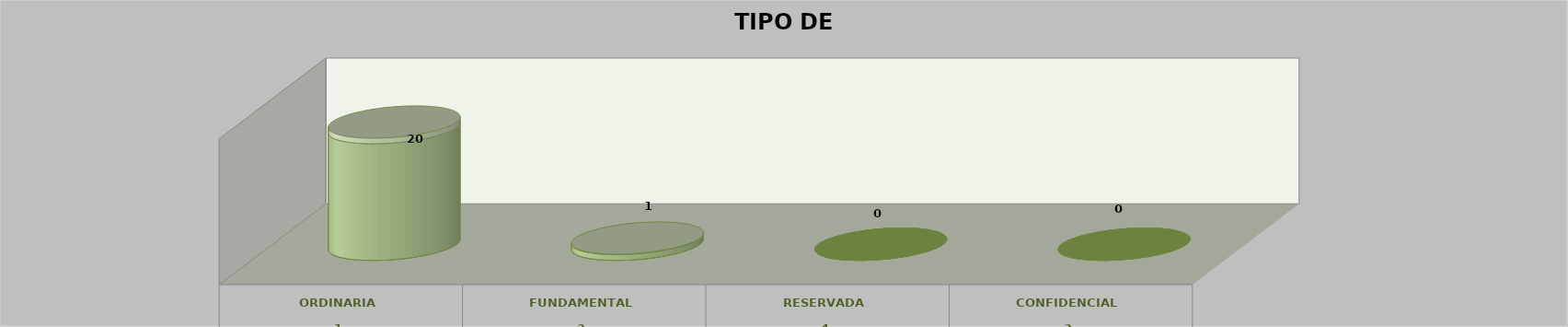
| Category | Series 0 | Series 1 | Series 2 | Series 3 | Series 4 |
|---|---|---|---|---|---|
| 0 |  |  |  | 20 | 0.952 |
| 1 |  |  |  | 1 | 0.048 |
| 2 |  |  |  | 0 | 0 |
| 3 |  |  |  | 0 | 0 |